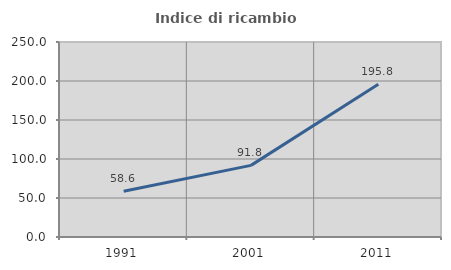
| Category | Indice di ricambio occupazionale  |
|---|---|
| 1991.0 | 58.639 |
| 2001.0 | 91.822 |
| 2011.0 | 195.813 |